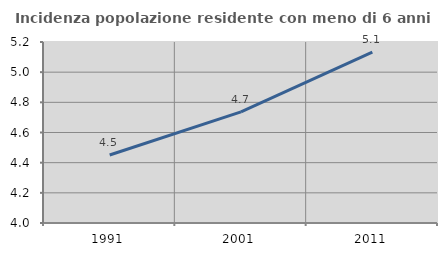
| Category | Incidenza popolazione residente con meno di 6 anni |
|---|---|
| 1991.0 | 4.451 |
| 2001.0 | 4.737 |
| 2011.0 | 5.133 |